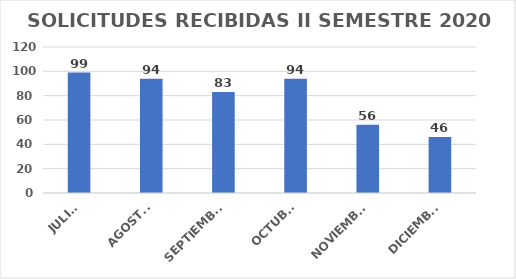
| Category | No. Solicitudes |
|---|---|
| JULIO | 99 |
| AGOSTO | 94 |
| SEPTIEMBRE | 83 |
| OCTUBRE | 94 |
| NOVIEMBRE | 56 |
| DICIEMBRE | 46 |